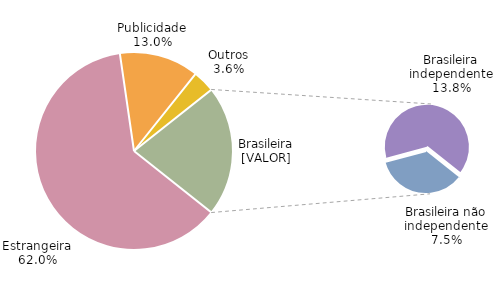
| Category | Series 0 |
|---|---|
| Estrangeira | 0.62 |
| Publicidade | 0.13 |
| Outros | 0.036 |
| Brasileira não independente | 0.075 |
| Brasileira independente | 0.138 |